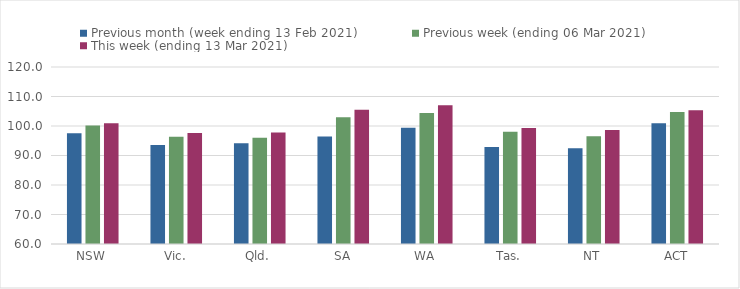
| Category | Previous month (week ending 13 Feb 2021) | Previous week (ending 06 Mar 2021) | This week (ending 13 Mar 2021) |
|---|---|---|---|
| NSW | 97.57 | 100.19 | 100.92 |
| Vic. | 93.54 | 96.39 | 97.65 |
| Qld. | 94.18 | 96.05 | 97.78 |
| SA | 96.46 | 102.93 | 105.54 |
| WA | 99.42 | 104.38 | 107.06 |
| Tas. | 92.86 | 98.03 | 99.35 |
| NT | 92.42 | 96.53 | 98.65 |
| ACT | 100.93 | 104.71 | 105.32 |